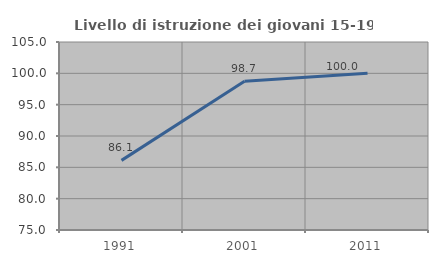
| Category | Livello di istruzione dei giovani 15-19 anni |
|---|---|
| 1991.0 | 86.111 |
| 2001.0 | 98.734 |
| 2011.0 | 100 |